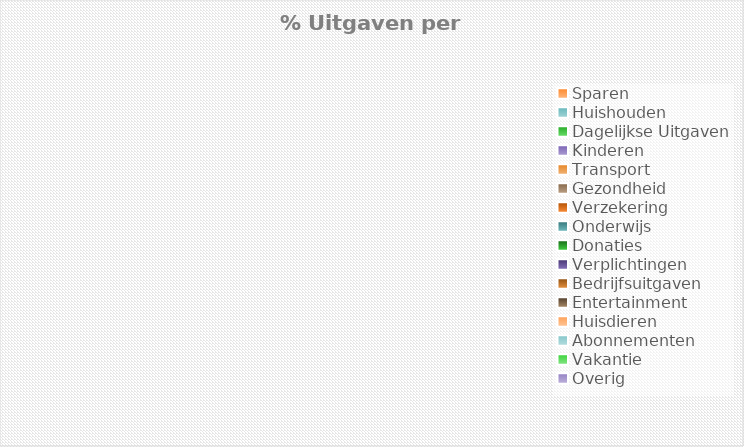
| Category | Series 0 |
|---|---|
| Sparen | 0 |
| Huishouden | 0 |
| Dagelijkse Uitgaven | 0 |
| Kinderen | 0 |
| Transport | 0 |
| Gezondheid | 0 |
| Verzekering | 0 |
| Onderwijs | 0 |
| Donaties | 0 |
| Verplichtingen | 0 |
| Bedrijfsuitgaven | 0 |
| Entertainment | 0 |
| Huisdieren | 0 |
| Abonnementen | 0 |
| Vakantie | 0 |
| Overig | 0 |